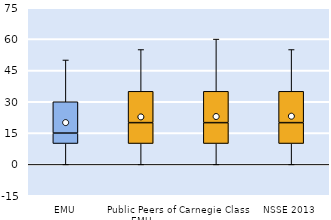
| Category | 25th | 50th | 75th |
|---|---|---|---|
| EMU | 10 | 5 | 15 |
| Public Peers of EMU | 10 | 10 | 15 |
| Carnegie Class | 10 | 10 | 15 |
| NSSE 2013 | 10 | 10 | 15 |